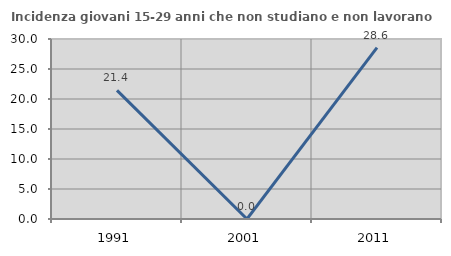
| Category | Incidenza giovani 15-29 anni che non studiano e non lavorano  |
|---|---|
| 1991.0 | 21.429 |
| 2001.0 | 0 |
| 2011.0 | 28.571 |